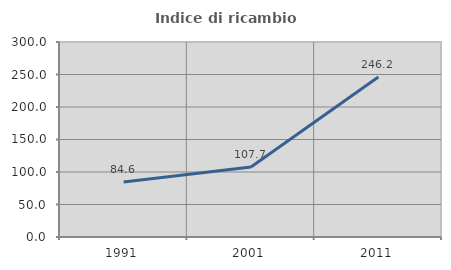
| Category | Indice di ricambio occupazionale  |
|---|---|
| 1991.0 | 84.615 |
| 2001.0 | 107.692 |
| 2011.0 | 246.154 |